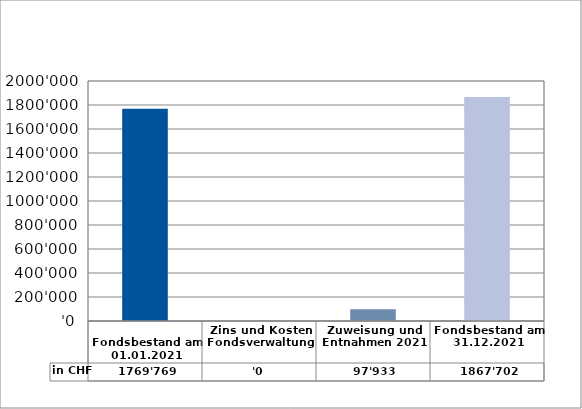
| Category | in CHF |
|---|---|
| 
Fondsbestand am 01.01.2021

 | 1769769 |
| Zins und Kosten Fondsverwaltung | 0 |
| Zuweisung und Entnahmen 2021 | 97933.25 |
| Fondsbestand am 31.12.2021 | 1867702.25 |